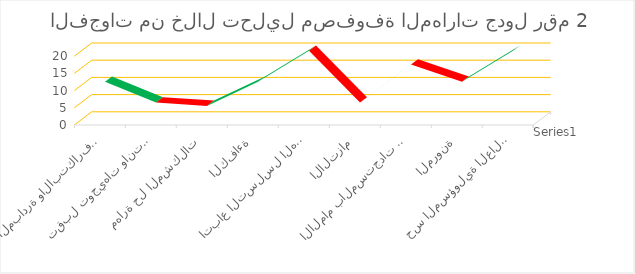
| Category | Series 0 |
|---|---|
| المبادرة والابتكارفي المهام المسؤولة عنها | 11 |
| تقبل توجيهات وانتقادات الرؤساء  | 5 |
| مهارة حل المشكلات | 4 |
| الكفاءة | 11 |
| اتباع التسلسل الهرمي  | 20 |
| الالتزام | 5 |
| الالمام بالمستجدات في نظام العمل ومتطلبات العمل   | 16 |
| المرونة | 11 |
| حس المسؤولية العالي   | 20 |